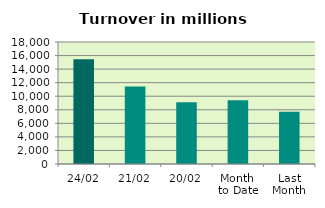
| Category | Series 0 |
|---|---|
| 24/02 | 15448.407 |
| 21/02 | 11439.088 |
| 20/02 | 9115.377 |
| Month 
to Date | 9397.324 |
| Last
Month | 7723.751 |